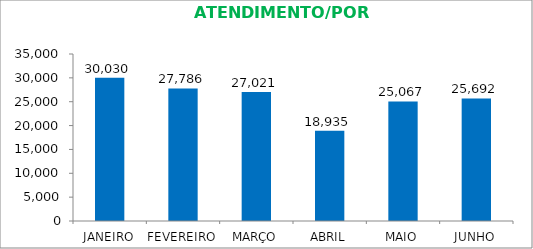
| Category | JANEIRO |
|---|---|
| JANEIRO | 30030 |
| FEVEREIRO | 27786 |
| MARÇO | 27021 |
| ABRIL | 18935 |
| MAIO | 25067 |
| JUNHO | 25692 |